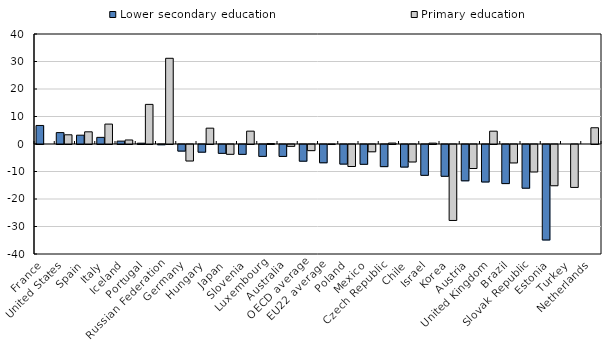
| Category | Lower secondary education | Primary education |
|---|---|---|
| France | 6.742 | 0 |
| United States | 4.143 | 3.351 |
| Spain | 3.21 | 4.432 |
| Italy | 2.413 | 7.241 |
| Iceland | 1.047 | 1.465 |
| Portugal | 0.297 | 14.408 |
| Russian Federation | -0.094 | 31.168 |
| Germany | -2.396 | -5.994 |
| Hungary | -2.793 | 5.758 |
| Japan | -3.217 | -3.572 |
| Slovenia | -3.588 | 4.674 |
| Luxembourg | -4.323 | 0.159 |
| Australia | -4.336 | -0.673 |
| OECD average | -6.072 | -2.237 |
| EU22 average | -6.646 | -0.008 |
| Poland | -7.122 | -8.003 |
| Mexico | -7.202 | -2.648 |
| Czech Republic | -8.049 | 0.343 |
| Chile | -8.209 | -6.352 |
| Israel | -11.212 | 0.316 |
| Korea | -11.558 | -27.621 |
| Austria | -13.2 | -8.729 |
| United Kingdom | -13.631 | 4.663 |
| Brazil | -14.213 | -6.699 |
| Slovak Republic | -15.888 | -9.986 |
| Estonia | -34.718 | -14.995 |
| Turkey | 0 | -15.609 |
| Netherlands | 0 | 5.909 |